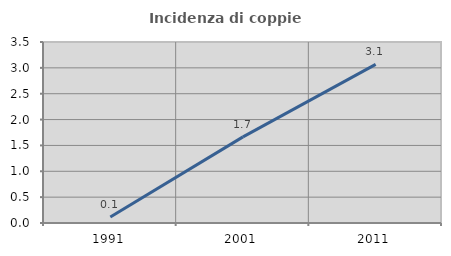
| Category | Incidenza di coppie miste |
|---|---|
| 1991.0 | 0.117 |
| 2001.0 | 1.665 |
| 2011.0 | 3.066 |